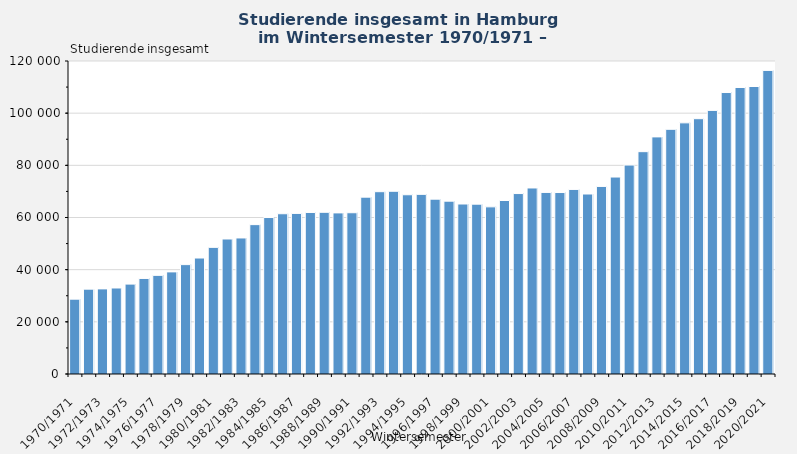
| Category | Studierende insgesamt |
|---|---|
| 1970/1971 | 28686 |
| 1971/1972 | 32538 |
| 1972/1973 | 32631 |
| 1973/1974 | 32976 |
| 1974/1975 | 34461 |
| 1975/1976 | 36633 |
| 1976/1977 | 37816 |
| 1977/1978 | 39148 |
| 1978/1979 | 41936 |
| 1979/1980 | 44464 |
| 1980/1981 | 48552 |
| 1981/1982 | 51758 |
| 1982/1983 | 52153 |
| 1983/1984 | 57264 |
| 1984/1985 | 59994 |
| 1985/1986 | 61443 |
| 1986/1987 | 61574 |
| 1987/1988 | 61926 |
| 1988/1989 | 61993 |
| 1989/1990 | 61764 |
| 1990/1991 | 61827 |
| 1991/1992 | 67805 |
| 1992/1993 | 69892 |
| 1993/1994 | 70052 |
| 1994/1995 | 68720 |
| 1995/1996 | 68868 |
| 1996/1997 | 67032 |
| 1997/1998 | 66262 |
| 1998/1999 | 65175 |
| 1999/2000 | 65115 |
| 2000/2001 | 64083 |
| 2001/2002 | 66513 |
| 2002/2003 | 69180 |
| 2003/2004 | 71319 |
| 2004/2005 | 69618 |
| 2005/2006 | 69573 |
| 2006/2007 | 70761 |
| 2007/2008 | 69009 |
| 2008/2009 | 71910 |
| 2009/2010 | 75513 |
| 2010/2011 | 80115 |
| 2011/2012 | 85242 |
| 2012/2013 | 90903 |
| 2013/2014 | 93813 |
| 2014/2015 | 96285 |
| 2015/2016 | 97881 |
| 2016/2017 | 101070 |
| 2017/2018 | 107913 |
| 2018/2019 | 109842 |
| 2019/2020 | 110220 |
| 2020/2021 | 116394 |